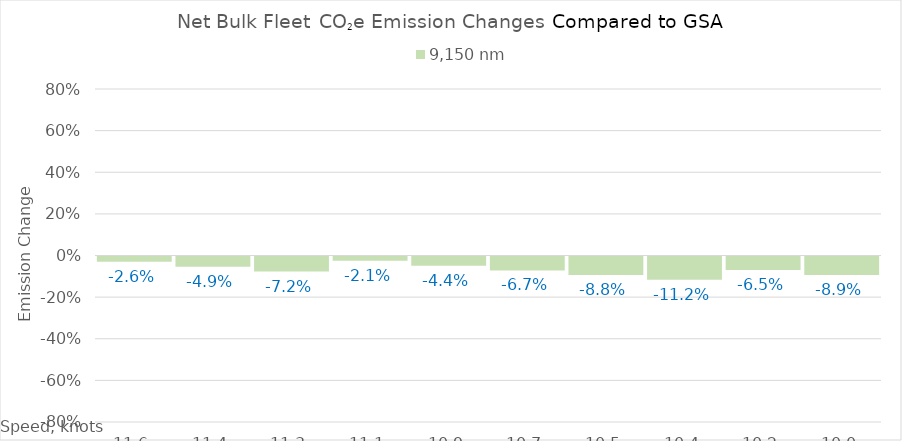
| Category | 9,150 |
|---|---|
| 11.620000000000001 | -0.026 |
| 11.440000000000001 | -0.049 |
| 11.260000000000002 | -0.072 |
| 11.080000000000002 | -0.021 |
| 10.900000000000002 | -0.044 |
| 10.720000000000002 | -0.067 |
| 10.540000000000003 | -0.088 |
| 10.360000000000003 | -0.112 |
| 10.180000000000003 | -0.065 |
| 10.000000000000004 | -0.089 |